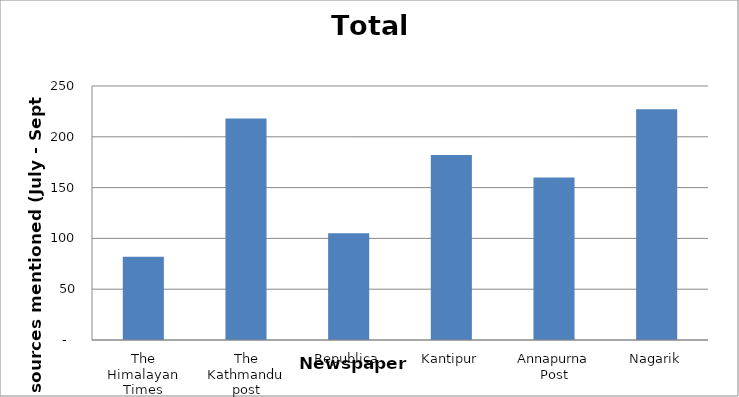
| Category | Total |
|---|---|
| The Himalayan Times | 82 |
| The Kathmandu post | 218 |
| Republica | 105 |
| Kantipur | 182 |
| Annapurna Post | 160 |
| Nagarik | 227 |